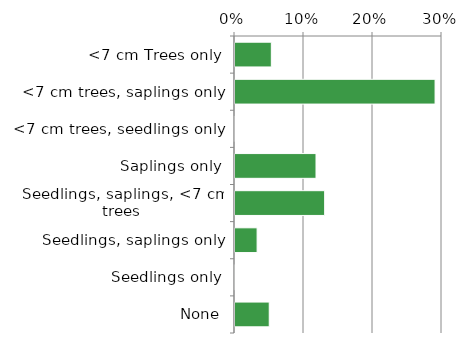
| Category | Native |
|---|---|
| None | 0.051 |
| Seedlings only | 0 |
| Seedlings, saplings only | 0.033 |
| Seedlings, saplings, <7 cm trees | 0.131 |
| Saplings only | 0.119 |
| <7 cm trees, seedlings only | 0 |
| <7 cm trees, saplings only | 0.291 |
| <7 cm Trees only | 0.054 |